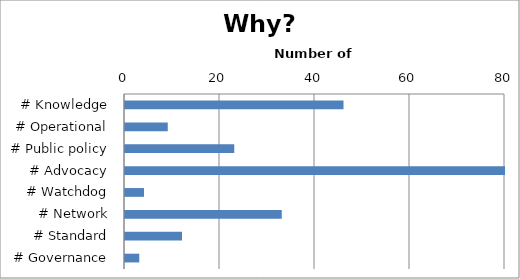
| Category | Series 0 |
|---|---|
| # Knowledge | 46 |
| # Operational | 9 |
| # Public policy | 23 |
| # Advocacy | 80 |
| # Watchdog | 4 |
| # Network | 33 |
| # Standard | 12 |
| # Governance | 3 |